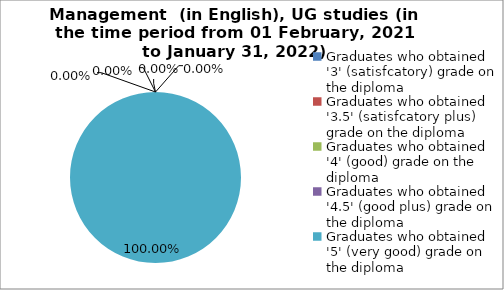
| Category | Series 0 |
|---|---|
| Graduates who obtained '3' (satisfcatory) grade on the diploma  | 0 |
| Graduates who obtained '3.5' (satisfcatory plus) grade on the diploma  | 0 |
| Graduates who obtained '4' (good) grade on the diploma  | 0 |
| Graduates who obtained '4.5' (good plus) grade on the diploma  | 0 |
| Graduates who obtained '5' (very good) grade on the diploma  | 100 |